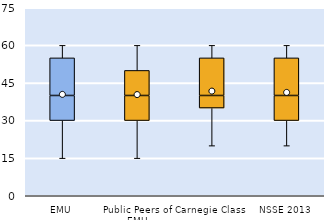
| Category | 25th | 50th | 75th |
|---|---|---|---|
| EMU | 30 | 10 | 15 |
| Public Peers of EMU | 30 | 10 | 10 |
| Carnegie Class | 35 | 5 | 15 |
| NSSE 2013 | 30 | 10 | 15 |